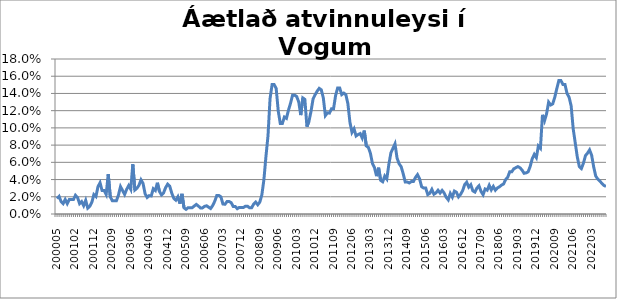
| Category | Series 0 |
|---|---|
| 200005 | 0.018 |
| 200006 | 0.02 |
| 200007 | 0.014 |
| 200008 | 0.012 |
| 200009 | 0.017 |
| 200010 | 0.012 |
| 200011 | 0.017 |
| 200012 | 0.017 |
| 200101 | 0.017 |
| 200102 | 0.022 |
| 200103 | 0.019 |
| 200104 | 0.012 |
| 200105 | 0.014 |
| 200106 | 0.01 |
| 200107 | 0.016 |
| 200109 | 0.007 |
| 200110 | 0.009 |
| 200111 | 0.014 |
| 200112 | 0.023 |
| 200201 | 0.02 |
| 200202 | 0.032 |
| 200203 | 0.036 |
| 200204 | 0.027 |
| 200205 | 0.027 |
| 200206 | 0.023 |
| 200207 | 0.046 |
| 200208 | 0.02 |
| 200209 | 0.015 |
| 200210 | 0.015 |
| 200211 | 0.015 |
| 200212 | 0.022 |
| 200301 | 0.032 |
| 200302 | 0.027 |
| 200303 | 0.023 |
| 200304 | 0.029 |
| 200305 | 0.033 |
| 200306 | 0.029 |
| 200307 | 0.058 |
| 200308 | 0.028 |
| 200309 | 0.03 |
| 200310 | 0.033 |
| 200311 | 0.04 |
| 200312 | 0.035 |
| 200401 | 0.023 |
| 200402 | 0.019 |
| 200403 | 0.021 |
| 200404 | 0.021 |
| 200405 | 0.029 |
| 200406 | 0.027 |
| 200407 | 0.036 |
| 200408 | 0.026 |
| 200409 | 0.022 |
| 200410 | 0.024 |
| 200411 | 0.031 |
| 200412 | 0.035 |
| 200501 | 0.032 |
| 200502 | 0.024 |
| 200503 | 0.018 |
| 200504 | 0.016 |
| 200505 | 0.02 |
| 200506 | 0.012 |
| 200507 | 0.023 |
| 200508 | 0.007 |
| 200509 | 0.005 |
| 200510 | 0.007 |
| 200511 | 0.007 |
| 200512 | 0.007 |
| 200601 | 0.009 |
| 200602 | 0.011 |
| 200603 | 0.009 |
| 200604 | 0.007 |
| 200605 | 0.007 |
| 200606 | 0.009 |
| 200607 | 0.01 |
| 200608 | 0.008 |
| 200609 | 0.006 |
| 200610 | 0.01 |
| 200611 | 0.015 |
| 200612 | 0.021 |
| 200701 | 0.022 |
| 200702 | 0.02 |
| 200703 | 0.012 |
| 200704 | 0.011 |
| 200705 | 0.014 |
| 200706 | 0.014 |
| 200707 | 0.013 |
| 200708 | 0.009 |
| 200709 | 0.009 |
| 200710 | 0.006 |
| 200711 | 0.008 |
| 200712 | 0.008 |
| 200801 | 0.008 |
| 200802 | 0.009 |
| 200803 | 0.009 |
| 200804 | 0.007 |
| 200805 | 0.007 |
| 200806 | 0.012 |
| 200807 | 0.014 |
| 200808 | 0.011 |
| 200809 | 0.014 |
| 200810 | 0.022 |
| 200811 | 0.04 |
| 200812 | 0.067 |
| 200901 | 0.091 |
| 200902 | 0.134 |
| 200903 | 0.15 |
| 200904 | 0.15 |
| 200905 | 0.146 |
| 200906 | 0.12 |
| 200907 | 0.105 |
| 200908 | 0.105 |
| 200909 | 0.113 |
| 200910 | 0.111 |
| 200911 | 0.121 |
| 200912 | 0.129 |
| 201001 | 0.138 |
| 201002 | 0.138 |
| 201003 | 0.136 |
| 201004 | 0.13 |
| 201005 | 0.115 |
| 201006 | 0.135 |
| 201007 | 0.133 |
| 201008 | 0.101 |
| 201009 | 0.108 |
| 201010 | 0.119 |
| 201011 | 0.134 |
| 201012 | 0.138 |
| 201101 | 0.143 |
| 201102 | 0.146 |
| 201103 | 0.144 |
| 201104 | 0.135 |
| 201105 | 0.114 |
| 201106 | 0.117 |
| 201107 | 0.117 |
| 201108 | 0.122 |
| 201109 | 0.122 |
| 201110 | 0.138 |
| 201111 | 0.146 |
| 201112 | 0.146 |
| 201201 | 0.139 |
| 201202 | 0.14 |
| 201203 | 0.139 |
| 201204 | 0.128 |
| 201205 | 0.106 |
| 201206 | 0.095 |
| 201207 | 0.099 |
| 201208 | 0.091 |
| 201209 | 0.092 |
| 201210 | 0.093 |
| 201211 | 0.088 |
| 201212 | 0.097 |
| 201301 | 0.079 |
| 201302 | 0.077 |
| 201303 | 0.07 |
| 201304 | 0.059 |
| 201305 | 0.054 |
| 201306 | 0.044 |
| 201307 | 0.054 |
| 201308 | 0.039 |
| 201309 | 0.037 |
| 201310 | 0.044 |
| 201311 | 0.041 |
| 201312 | 0.058 |
| 201401 | 0.071 |
| 201402 | 0.076 |
| 201403 | 0.081 |
| 201404 | 0.065 |
| 201405 | 0.058 |
| 201406 | 0.055 |
| 201407 | 0.047 |
| 201408 | 0.037 |
| 201409 | 0.037 |
| 201410 | 0.036 |
| 201411 | 0.038 |
| 201412 | 0.038 |
| 201501 | 0.042 |
| 201502 | 0.046 |
| 201503 | 0.041 |
| 201504 | 0.032 |
| 201505 | 0.03 |
| 201506 | 0.03 |
| 201507 | 0.023 |
| 201508 | 0.024 |
| 201509 | 0.029 |
| 201510 | 0.023 |
| 201511 | 0.025 |
| 201512 | 0.028 |
| 201601 | 0.024 |
| 201602 | 0.027 |
| 201603 | 0.024 |
| 201604 | 0.019 |
| 201605 | 0.016 |
| 201606 | 0.024 |
| 201607 | 0.02 |
| 201608 | 0.027 |
| 201609 | 0.025 |
| 201610 | 0.02 |
| 201611 | 0.023 |
| 201612 | 0.027 |
| 201701 | 0.034 |
| 201702 | 0.037 |
| 201703 | 0.031 |
| 201704 | 0.034 |
| 201705 | 0.027 |
| 201706 | 0.025 |
| 201707 | 0.03 |
| 201708 | 0.033 |
| 201709 | 0.026 |
| 201710 | 0.022 |
| 201711 | 0.029 |
| 201712 | 0.028 |
| 201801 | 0.033 |
| 201802 | 0.028 |
| 201803 | 0.032 |
| 201804 | 0.028 |
| 201805 | 0.03 |
| 201806 | 0.032 |
| 201807 | 0.034 |
| 201808 | 0.035 |
| 201809 | 0.04 |
| 201810 | 0.043 |
| 201811 | 0.049 |
| 201812 | 0.049 |
| 201901 | 0.052 |
| 201902 | 0.054 |
| 201903 | 0.055 |
| 201904 | 0.054 |
| 201905 | 0.051 |
| 201906 | 0.047 |
| 201907 | 0.048 |
| 201908 | 0.049 |
| 201909 | 0.055 |
| 201910 | 0.064 |
| 201911 | 0.069 |
| 201912 | 0.065 |
| 202001 | 0.079 |
| 202002 | 0.076 |
| 202003 | 0.115 |
| 202004 | 0.108 |
| 202005 | 0.116 |
| 202006 | 0.13 |
| 202007 | 0.127 |
| 202008 | 0.128 |
| 202009 | 0.136 |
| 202010 | 0.146 |
| 202011 | 0.155 |
| 202012 | 0.155 |
| 202101 | 0.15 |
| 202102 | 0.15 |
| 202103 | 0.14 |
| 202104 | 0.136 |
| 202105 | 0.125 |
| 202106 | 0.099 |
| 202107 | 0.082 |
| 202108 | 0.066 |
| 202109 | 0.055 |
| 202110 | 0.053 |
| 202111 | 0.059 |
| 202112 | 0.068 |
| 202201 | 0.071 |
| 202202 | 0.074 |
| 202203 | 0.068 |
| 202204 | 0.055 |
| 202205 | 0.044 |
| 202206 | 0.04 |
| 202207 | 0.038 |
| 202208 | 0.036 |
| 202209 | 0.033 |
| 202210 | 0.032 |